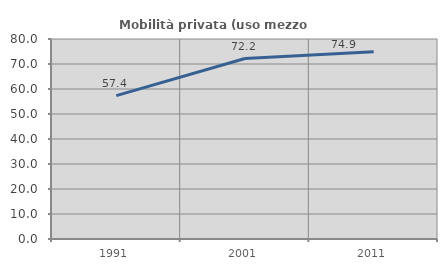
| Category | Mobilità privata (uso mezzo privato) |
|---|---|
| 1991.0 | 57.373 |
| 2001.0 | 72.184 |
| 2011.0 | 74.869 |